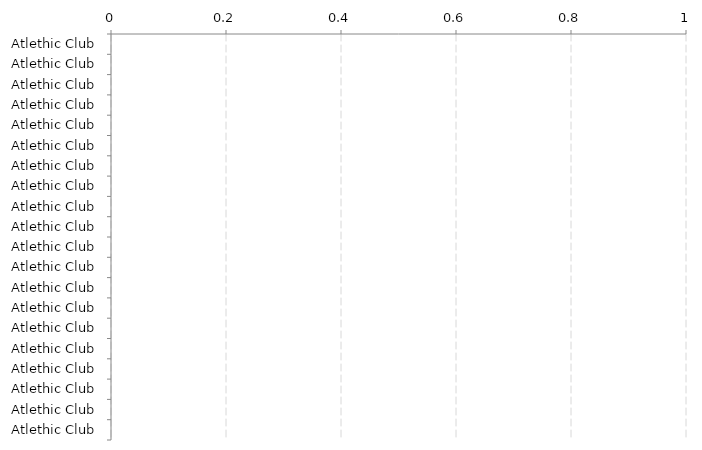
| Category | Series 0 |
|---|---|
| Atlethic Club | 0 |
| Atlethic Club | 0 |
| Atlethic Club | 0 |
| Atlethic Club | 0 |
| Atlethic Club | 0 |
| Atlethic Club | 0 |
| Atlethic Club | 0 |
| Atlethic Club | 0 |
| Atlethic Club | 0 |
| Atlethic Club | 0 |
| Atlethic Club | 0 |
| Atlethic Club | 0 |
| Atlethic Club | 0 |
| Atlethic Club | 0 |
| Atlethic Club | 0 |
| Atlethic Club | 0 |
| Atlethic Club | 0 |
| Atlethic Club | 0 |
| Atlethic Club | 0 |
| Atlethic Club | 0 |